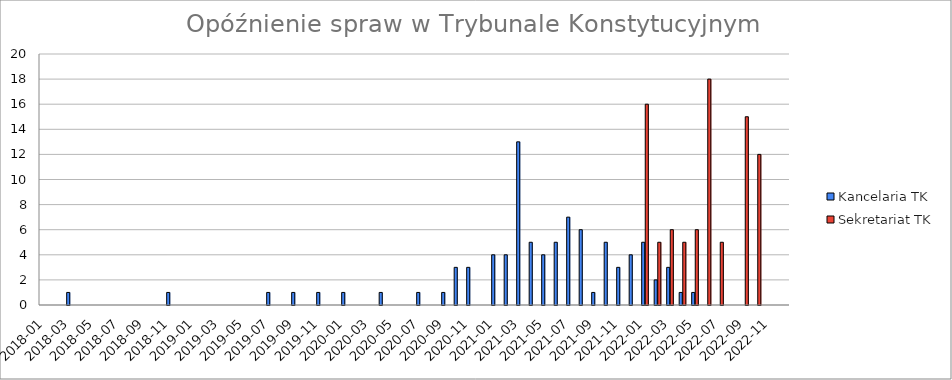
| Category | Kancelaria TK | Sekretariat TK |
|---|---|---|
| 2018-01-01 | 0 | 0 |
| 2018-02-01 | 0 | 0 |
| 2018-03-01 | 1 | 0 |
| 2018-04-01 | 0 | 0 |
| 2018-05-01 | 0 | 0 |
| 2018-06-01 | 0 | 0 |
| 2018-07-01 | 0 | 0 |
| 2018-08-01 | 0 | 0 |
| 2018-09-01 | 0 | 0 |
| 2018-10-01 | 0 | 0 |
| 2018-11-01 | 1 | 0 |
| 2018-12-01 | 0 | 0 |
| 2019-01-01 | 0 | 0 |
| 2019-02-01 | 0 | 0 |
| 2019-03-01 | 0 | 0 |
| 2019-04-01 | 0 | 0 |
| 2019-05-01 | 0 | 0 |
| 2019-06-01 | 0 | 0 |
| 2019-07-01 | 1 | 0 |
| 2019-08-01 | 0 | 0 |
| 2019-09-01 | 1 | 0 |
| 2019-10-01 | 0 | 0 |
| 2019-11-01 | 1 | 0 |
| 2019-12-01 | 0 | 0 |
| 2020-01-01 | 1 | 0 |
| 2020-02-01 | 0 | 0 |
| 2020-03-01 | 0 | 0 |
| 2020-04-01 | 1 | 0 |
| 2020-05-01 | 0 | 0 |
| 2020-06-01 | 0 | 0 |
| 2020-07-01 | 1 | 0 |
| 2020-08-01 | 0 | 0 |
| 2020-09-01 | 1 | 0 |
| 2020-10-01 | 3 | 0 |
| 2020-11-01 | 3 | 0 |
| 2020-12-01 | 0 | 0 |
| 2021-01-01 | 4 | 0 |
| 2021-02-01 | 4 | 0 |
| 2021-03-01 | 13 | 0 |
| 2021-04-01 | 5 | 0 |
| 2021-05-01 | 4 | 0 |
| 2021-06-01 | 5 | 0 |
| 2021-07-01 | 7 | 0 |
| 2021-08-01 | 6 | 0 |
| 2021-09-01 | 1 | 0 |
| 2021-10-01 | 5 | 0 |
| 2021-11-01 | 3 | 0 |
| 2021-12-01 | 4 | 0 |
| 2022-01-01 | 5 | 16 |
| 2022-02-01 | 2 | 5 |
| 2022-03-01 | 3 | 6 |
| 2022-04-01 | 1 | 5 |
| 2022-05-01 | 1 | 6 |
| 2022-06-01 | 0 | 18 |
| 2022-07-01 | 0 | 5 |
| 2022-08-01 | 0 | 0 |
| 2022-09-01 | 0 | 15 |
| 2022-10-01 | 0 | 12 |
| 2022-11-01 | 0 | 0 |
| 2022-12-01 | 0 | 0 |